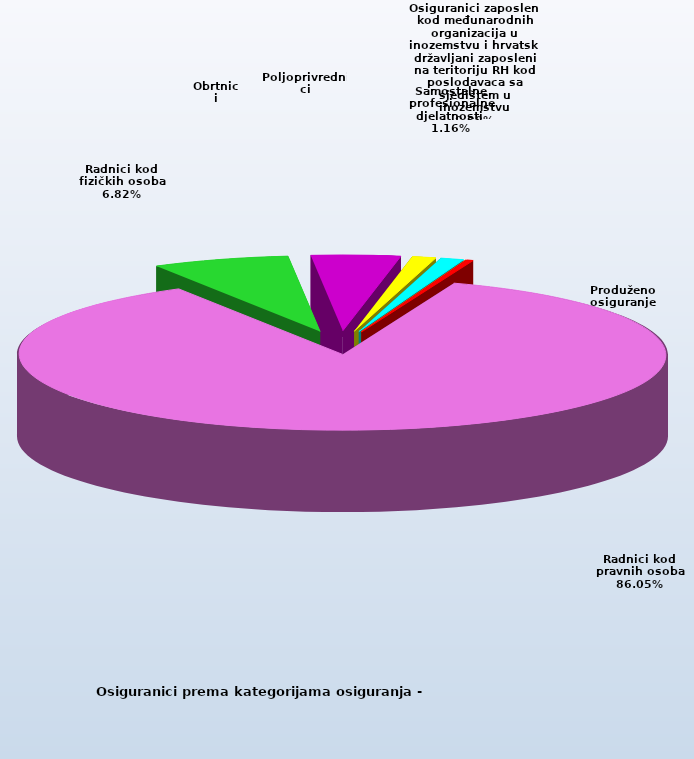
| Category | Series 0 |
|---|---|
| Radnici kod pravnih osoba | 1354395 |
| Radnici kod fizičkih osoba | 107327 |
| Obrtnici | 69716 |
| Poljoprivrednici | 18690 |
| Samostalne profesionalne djelatnosti  | 18313 |
| Osiguranici zaposleni kod međunarodnih organizacija u inozemstvu i hrvatski državljani zaposleni na teritoriju RH kod poslodavaca sa sjedištem u inozemstvu | 59 |
| Produženo osiguranje | 5449 |